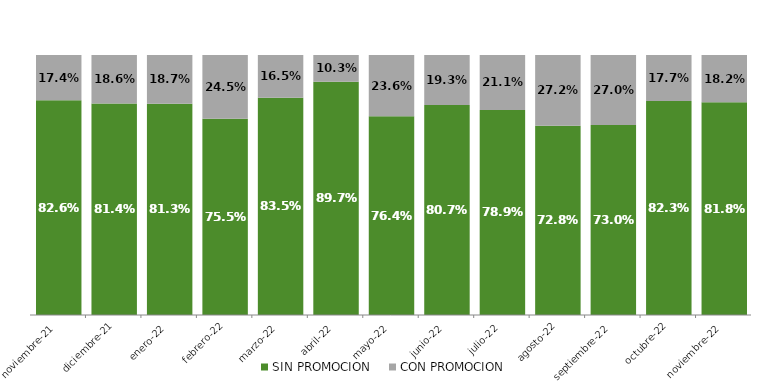
| Category | SIN PROMOCION   | CON PROMOCION   |
|---|---|---|
| 2021-11-01 | 0.826 | 0.174 |
| 2021-12-01 | 0.814 | 0.186 |
| 2022-01-01 | 0.813 | 0.187 |
| 2022-02-01 | 0.755 | 0.245 |
| 2022-03-01 | 0.835 | 0.165 |
| 2022-04-01 | 0.897 | 0.103 |
| 2022-05-01 | 0.764 | 0.236 |
| 2022-06-01 | 0.807 | 0.193 |
| 2022-07-01 | 0.789 | 0.211 |
| 2022-08-01 | 0.728 | 0.272 |
| 2022-09-01 | 0.73 | 0.27 |
| 2022-10-01 | 0.823 | 0.177 |
| 2022-11-01 | 0.818 | 0.182 |